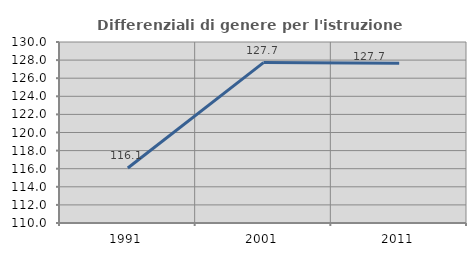
| Category | Differenziali di genere per l'istruzione superiore |
|---|---|
| 1991.0 | 116.076 |
| 2001.0 | 127.722 |
| 2011.0 | 127.658 |